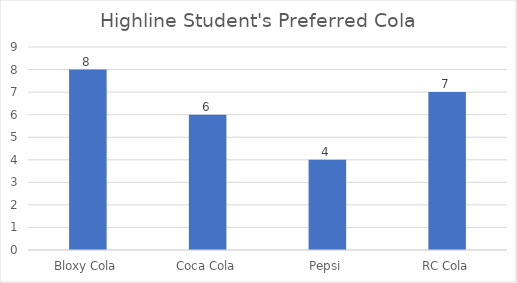
| Category | Total |
|---|---|
| Bloxy Cola | 8 |
| Coca Cola | 6 |
| Pepsi | 4 |
| RC Cola | 7 |